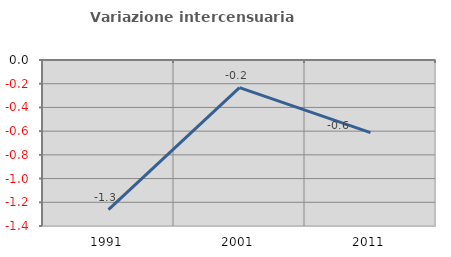
| Category | Variazione intercensuaria annua |
|---|---|
| 1991.0 | -1.263 |
| 2001.0 | -0.233 |
| 2011.0 | -0.613 |